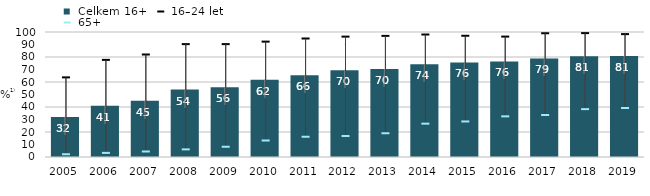
| Category |  Celkem 16+ |
|---|---|
| 2005.0 | 32.1 |
| 2006.0 | 41 |
| 2007.0 | 45 |
| 2008.0 | 54 |
| 2009.0 | 55.9 |
| 2010.0 | 61.8 |
| 2011.0 | 65.5 |
| 2012.0 | 69.5 |
| 2013.0 | 70.4 |
| 2014.0 | 74.232 |
| 2015.0 | 75.669 |
| 2016.0 | 76.481 |
| 2017.0 | 78.8 |
| 2018.0 | 80.7 |
| 2019.0 | 80.9 |